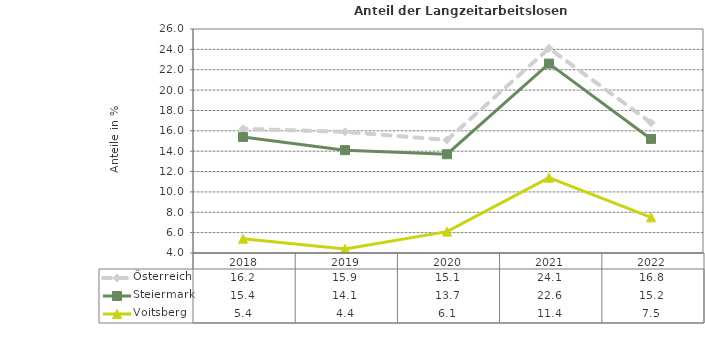
| Category | Österreich | Steiermark | Voitsberg |
|---|---|---|---|
| 2022.0 | 16.8 | 15.2 | 7.5 |
| 2021.0 | 24.1 | 22.6 | 11.4 |
| 2020.0 | 15.1 | 13.7 | 6.1 |
| 2019.0 | 15.9 | 14.1 | 4.4 |
| 2018.0 | 16.2 | 15.4 | 5.4 |